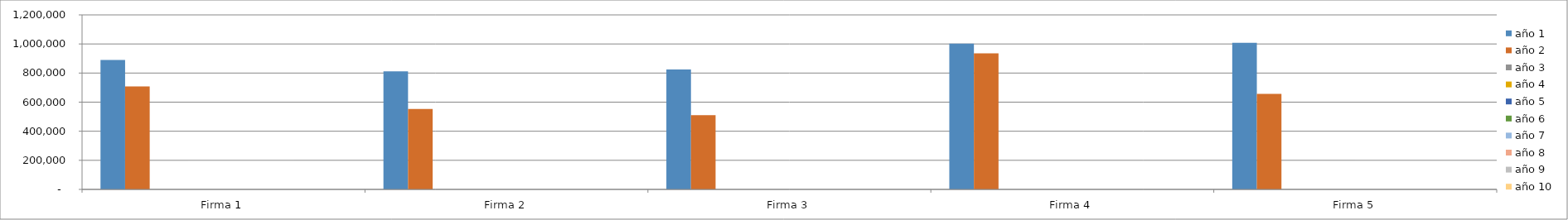
| Category | año 1 | año 2 | año 3 | año 4 | año 5 | año 6 | año 7 | año 8 | año 9 | año 10 |
|---|---|---|---|---|---|---|---|---|---|---|
| Firma 1 | 890450.022 | 707381.085 | 0 | 0 | 0 | 0 | 0 | 0 | 0 | 0 |
| Firma 2 | 812025.331 | 553745.113 | 0 | 0 | 0 | 0 | 0 | 0 | 0 | 0 |
| Firma 3 | 825124.008 | 509789.755 | 0 | 0 | 0 | 0 | 0 | 0 | 0 | 0 |
| Firma 4 | 1001719.655 | 935034.101 | 0 | 0 | 0 | 0 | 0 | 0 | 0 | 0 |
| Firma 5 | 1007894.408 | 656943.693 | 0 | 0 | 0 | 0 | 0 | 0 | 0 | 0 |